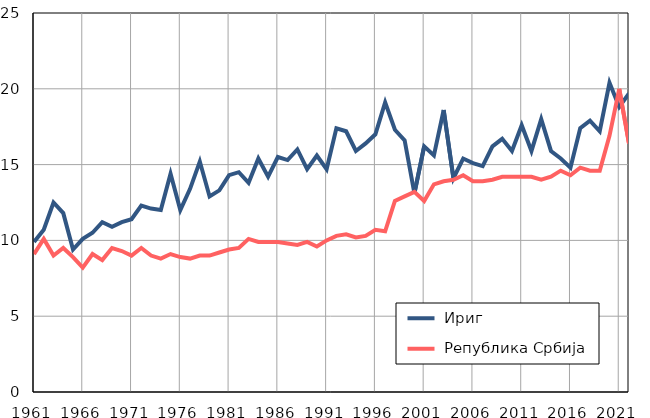
| Category |  Ириг |  Република Србија |
|---|---|---|
| 1961.0 | 9.9 | 9.1 |
| 1962.0 | 10.7 | 10.1 |
| 1963.0 | 12.5 | 9 |
| 1964.0 | 11.8 | 9.5 |
| 1965.0 | 9.4 | 8.9 |
| 1966.0 | 10.1 | 8.2 |
| 1967.0 | 10.5 | 9.1 |
| 1968.0 | 11.2 | 8.7 |
| 1969.0 | 10.9 | 9.5 |
| 1970.0 | 11.2 | 9.3 |
| 1971.0 | 11.4 | 9 |
| 1972.0 | 12.3 | 9.5 |
| 1973.0 | 12.1 | 9 |
| 1974.0 | 12 | 8.8 |
| 1975.0 | 14.4 | 9.1 |
| 1976.0 | 12 | 8.9 |
| 1977.0 | 13.4 | 8.8 |
| 1978.0 | 15.2 | 9 |
| 1979.0 | 12.9 | 9 |
| 1980.0 | 13.3 | 9.2 |
| 1981.0 | 14.3 | 9.4 |
| 1982.0 | 14.5 | 9.5 |
| 1983.0 | 13.8 | 10.1 |
| 1984.0 | 15.4 | 9.9 |
| 1985.0 | 14.2 | 9.9 |
| 1986.0 | 15.5 | 9.9 |
| 1987.0 | 15.3 | 9.8 |
| 1988.0 | 16 | 9.7 |
| 1989.0 | 14.7 | 9.9 |
| 1990.0 | 15.6 | 9.6 |
| 1991.0 | 14.7 | 10 |
| 1992.0 | 17.4 | 10.3 |
| 1993.0 | 17.2 | 10.4 |
| 1994.0 | 15.9 | 10.2 |
| 1995.0 | 16.4 | 10.3 |
| 1996.0 | 17 | 10.7 |
| 1997.0 | 19.1 | 10.6 |
| 1998.0 | 17.3 | 12.6 |
| 1999.0 | 16.6 | 12.9 |
| 2000.0 | 13.1 | 13.2 |
| 2001.0 | 16.2 | 12.6 |
| 2002.0 | 15.6 | 13.7 |
| 2003.0 | 18.6 | 13.9 |
| 2004.0 | 14.1 | 14 |
| 2005.0 | 15.4 | 14.3 |
| 2006.0 | 15.1 | 13.9 |
| 2007.0 | 14.9 | 13.9 |
| 2008.0 | 16.2 | 14 |
| 2009.0 | 16.7 | 14.2 |
| 2010.0 | 15.9 | 14.2 |
| 2011.0 | 17.6 | 14.2 |
| 2012.0 | 15.9 | 14.2 |
| 2013.0 | 18 | 14 |
| 2014.0 | 15.9 | 14.2 |
| 2015.0 | 15.4 | 14.6 |
| 2016.0 | 14.8 | 14.3 |
| 2017.0 | 17.4 | 14.8 |
| 2018.0 | 17.9 | 14.6 |
| 2019.0 | 17.2 | 14.6 |
| 2020.0 | 20.4 | 16.9 |
| 2021.0 | 18.8 | 20 |
| 2022.0 | 19.7 | 16.4 |